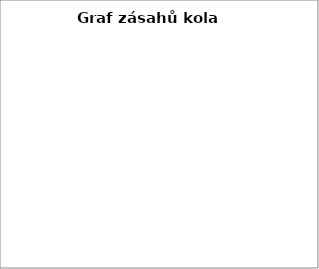
| Category | 5 4 3 2 1 0 |
|---|---|
| 5.0 | 0 |
| 4.0 | 0 |
| 3.0 | 0 |
| 2.0 | 0 |
| 1.0 | 0 |
| 0.0 | 0 |